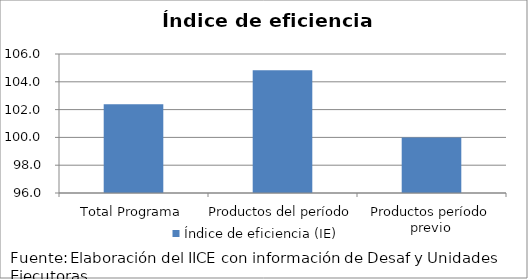
| Category | Índice de eficiencia (IE)  |
|---|---|
| Total Programa | 102.381 |
| Productos del período | 104.834 |
| Productos período previo | 100 |